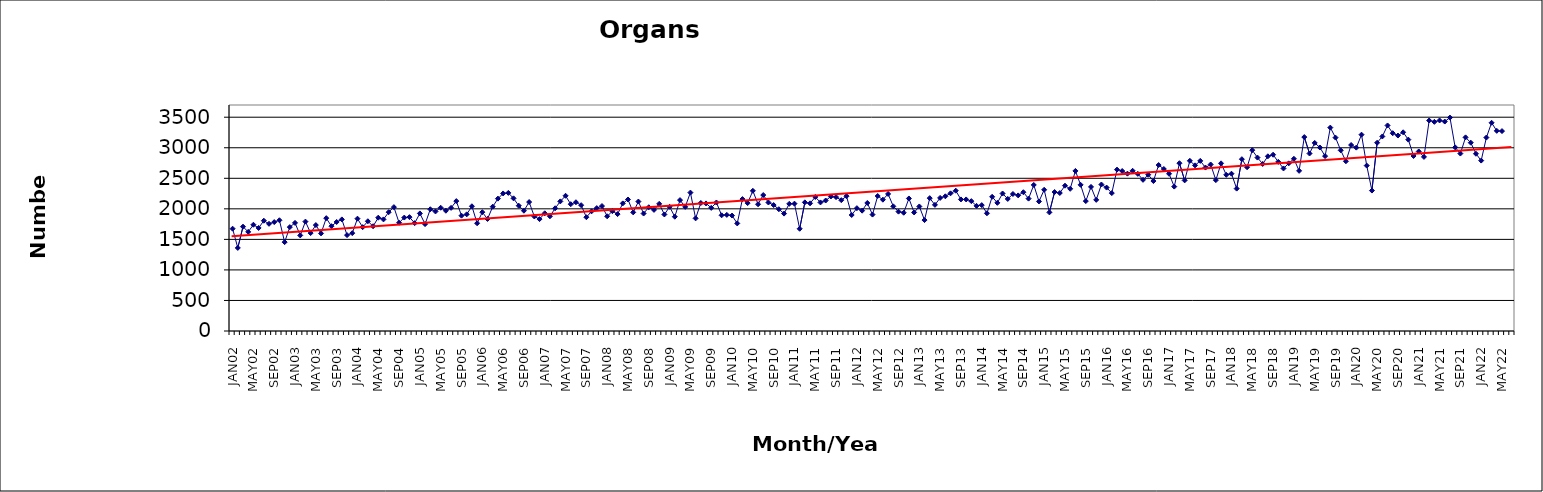
| Category | Series 0 |
|---|---|
| JAN02 | 1675 |
| FEB02 | 1360 |
| MAR02 | 1708 |
| APR02 | 1623 |
| MAY02 | 1740 |
| JUN02 | 1687 |
| JUL02 | 1806 |
| AUG02 | 1755 |
| SEP02 | 1783 |
| OCT02 | 1813 |
| NOV02 | 1455 |
| DEC02 | 1701 |
| JAN03 | 1770 |
| FEB03 | 1565 |
| MAR03 | 1791 |
| APR03 | 1603 |
| MAY03 | 1734 |
| JUN03 | 1598 |
| JUL03 | 1847 |
| AUG03 | 1716 |
| SEP03 | 1785 |
| OCT03 | 1827 |
| NOV03 | 1570 |
| DEC03 | 1602 |
| JAN04 | 1839 |
| FEB04 | 1700 |
| MAR04 | 1797 |
| APR04 | 1715 |
| MAY04 | 1855 |
| JUN04 | 1827 |
| JUL04 | 1945 |
| AUG04 | 2028 |
| SEP04 | 1773 |
| OCT04 | 1857 |
| NOV04 | 1864 |
| DEC04 | 1766 |
| JAN05 | 1925 |
| FEB05 | 1750 |
| MAR05 | 1993 |
| APR05 | 1957 |
| MAY05 | 2018 |
| JUN05 | 1969 |
| JUL05 | 2016 |
| AUG05 | 2127 |
| SEP05 | 1888 |
| OCT05 | 1910 |
| NOV05 | 2042 |
| DEC05 | 1764 |
| JAN06 | 1945 |
| FEB06 | 1834 |
| MAR06 | 2035 |
| APR06 | 2167 |
| MAY06 | 2252 |
| JUN06 | 2261 |
| JUL06 | 2172 |
| AUG06 | 2051 |
| SEP06 | 1969 |
| OCT06 | 2111 |
| NOV06 | 1875 |
| DEC06 | 1832 |
| JAN07 | 1927 |
| FEB07 | 1878 |
| MAR07 | 2009 |
| APR07 | 2122 |
| MAY07 | 2214 |
| JUN07 | 2076 |
| JUL07 | 2108 |
| AUG07 | 2060 |
| SEP07 | 1863 |
| OCT07 | 1959 |
| NOV07 | 2012 |
| DEC07 | 2046 |
| JAN08 | 1878 |
| FEB08 | 1962 |
| MAR08 | 1914 |
| APR08 | 2089 |
| MAY08 | 2153 |
| JUN08 | 1942 |
| JUL08 | 2119 |
| AUG08 | 1923 |
| SEP08 | 2026 |
| OCT08 | 1983 |
| NOV08 | 2082 |
| DEC08 | 1908 |
| JAN09 | 2033 |
| FEB09 | 1871 |
| MAR09 | 2143 |
| APR09 | 2032 |
| MAY09 | 2266 |
| JUN09 | 1844 |
| JUL09 | 2096 |
| AUG09 | 2089 |
| SEP09 | 2016 |
| OCT09 | 2104 |
| NOV09 | 1894 |
| DEC09 | 1901 |
| JAN10 | 1890 |
| FEB10 | 1761 |
| MAR10 | 2160 |
| APR10 | 2094 |
| MAY10 | 2295 |
| JUN10 | 2075 |
| JUL10 | 2226 |
| AUG10 | 2104 |
| SEP10 | 2062 |
| OCT10 | 1994 |
| NOV10 | 1922 |
| DEC10 | 2082 |
| JAN11 | 2085 |
| FEB11 | 1674 |
| MAR11 | 2106 |
| APR11 | 2090 |
| MAY11 | 2194 |
| JUN11 | 2105 |
| JUL11 | 2136 |
| AUG11 | 2202 |
| SEP11 | 2192 |
| OCT11 | 2142 |
| NOV11 | 2207 |
| DEC11 | 1899 |
| JAN12 | 2011 |
| FEB12 | 1970 |
| MAR12 | 2096 |
| APR12 | 1906 |
| MAY12 | 2210 |
| JUN12 | 2150 |
| JUL12 | 2244 |
| AUG12 | 2041 |
| SEP12 | 1954 |
| OCT12 | 1936 |
| NOV12 | 2170 |
| DEC12 | 1941 |
| JAN13 | 2039 |
| FEB13 | 1816 |
| MAR13 | 2175 |
| APR13 | 2065 |
| MAY13 | 2179 |
| JUN13 | 2205 |
| JUL13 | 2254 |
| AUG13 | 2297 |
| SEP13 | 2154 |
| OCT13 | 2154 |
| NOV13 | 2126 |
| DEC13 | 2049 |
| JAN14 | 2061 |
| FEB14 | 1927 |
| MAR14 | 2197 |
| APR14 | 2098 |
| MAY14 | 2251 |
| JUN14 | 2162 |
| JUL14 | 2243 |
| AUG14 | 2220 |
| SEP14 | 2272 |
| OCT14 | 2167 |
| NOV14 | 2391 |
| DEC14 | 2121 |
| JAN15 | 2312 |
| FEB15 | 1942 |
| MAR15 | 2275 |
| APR15 | 2259 |
| MAY15 | 2379 |
| JUN15 | 2328 |
| JUL15 | 2621 |
| AUG15 | 2393 |
| SEP15 | 2127 |
| OCT15 | 2359 |
| NOV15 | 2147 |
| DEC15 | 2398 |
| JAN16 | 2348 |
| FEB16 | 2258 |
| MAR16 | 2642 |
| APR16 | 2619 |
| MAY16 | 2576 |
| JUN16 | 2623 |
| JUL16 | 2573 |
| AUG16 | 2475 |
| SEP16 | 2559 |
| OCT16 | 2455 |
| NOV16 | 2717 |
| DEC16 | 2652 |
| JAN17 | 2574 |
| FEB17 | 2364 |
| MAR17 | 2747 |
| APR17 | 2466 |
| MAY17 | 2786 |
| JUN17 | 2712 |
| JUL17 | 2785 |
| AUG17 | 2676 |
| SEP17 | 2726 |
| OCT17 | 2470 |
| NOV17 | 2745 |
| DEC17 | 2557 |
| JAN18 | 2575 |
| FEB18 | 2331 |
| MAR18 | 2813 |
| APR18 | 2681 |
| MAY18 | 2960 |
| JUN18 | 2839 |
| JUL18 | 2735 |
| AUG18 | 2860 |
| SEP18 | 2886 |
| OCT18 | 2769 |
| NOV18 | 2661 |
| DEC18 | 2745 |
| JAN19 | 2819 |
| FEB19 | 2622 |
| MAR19 | 3175 |
| APR19 | 2906 |
| MAY19 | 3079 |
| JUN19 | 3004 |
| JUL19 | 2863 |
| AUG19 | 3330 |
| SEP19 | 3166 |
| OCT19 | 2958 |
| NOV19 | 2779 |
| DEC19 | 3045 |
| JAN20 | 3002 |
| FEB20 | 3214 |
| MAR20 | 2708 |
| APR20 | 2299 |
| MAY20 | 3082 |
| JUN20 | 3185 |
| JUL20 | 3365 |
| AUG20 | 3238 |
| SEP20 | 3200 |
| OCT20 | 3253 |
| NOV20 | 3133 |
| DEC20 | 2865 |
| JAN21 | 2939 |
| FEB21 | 2850 |
| MAR21 | 3446 |
| APR21 | 3424 |
| MAY21 | 3447 |
| JUN21 | 3429 |
| JUL21 | 3494 |
| AUG21 | 3006 |
| SEP21 | 2905 |
| OCT21 | 3170 |
| NOV21 | 3083 |
| DEC21 | 2902 |
| JAN22 | 2790 |
| FEB22 | 3167 |
| MAR22 | 3409 |
| APR22 | 3277 |
| MAY22 | 3273 |